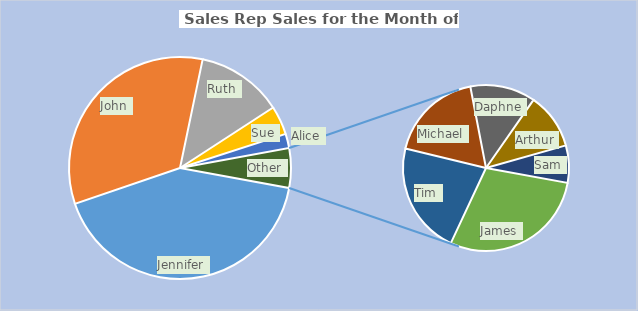
| Category | Sales |
|---|---|
| Jennifer | 10000 |
| John | 8000 |
| Ruth | 3000 |
| Sue | 1000 |
| Alice | 500 |
| James | 400 |
| Tim | 300 |
| Michael | 250 |
| Daphne | 175 |
| Arthur | 150 |
| Sam | 100 |